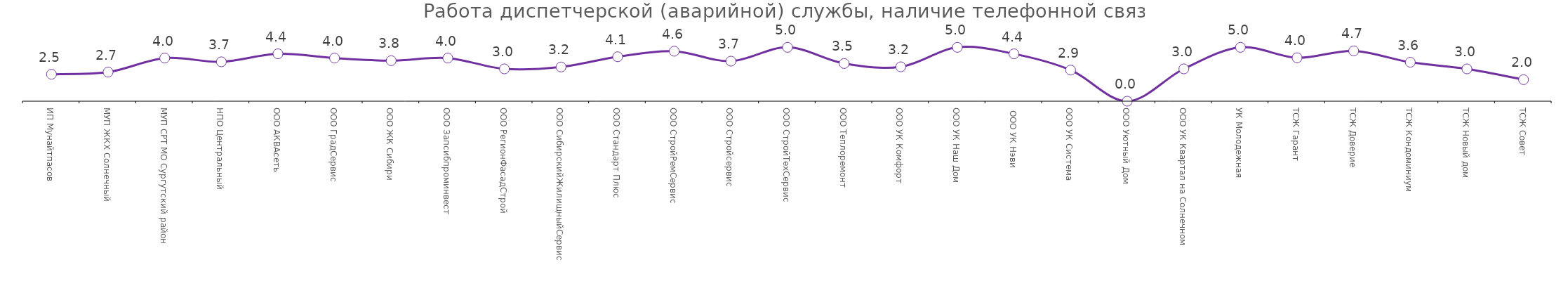
| Category |  Работа диспетчерской (аварийной) службы, наличие телефонной связи |
|---|---|
| ИП Мунайтпасов | 2.5 |
| МУП ЖКХ Солнечный | 2.7 |
| МУП СРТ МО Сургутский район | 4 |
| НПО Центральный | 3.656 |
| ООО АКВАсеть | 4.398 |
| ООО ГрадСервис | 4 |
| ООО ЖК Сибири | 3.762 |
| ООО Запсибпроминвест | 4 |
| ООО РегионФасадСтрой | 3 |
| ООО СибирскийЖилищныйСервис | 3.179 |
| ООО Стандарт Плюс | 4.125 |
| ООО СтройРемСервис | 4.638 |
| ООО Стройсервис | 3.714 |
| ООО СтройТехСервис | 5 |
| ООО Теплоремонт | 3.5 |
| ООО УК Комфорт | 3.192 |
| ООО УК Наш Дом | 5 |
|  ООО УК Нэви | 4.396 |
| ООО УК Система | 2.889 |
| ООО Уютный Дом | 0 |
| ООО УК Квартал на Солнечном | 3 |
| УК Молодежная | 5 |
| ТСЖ Гарант | 4.031 |
| ТСЖ Доверие | 4.667 |
| ТСЖ Кондоминиум | 3.614 |
| ТСЖ Новый дом | 3 |
| ТСЖ Совет | 2 |